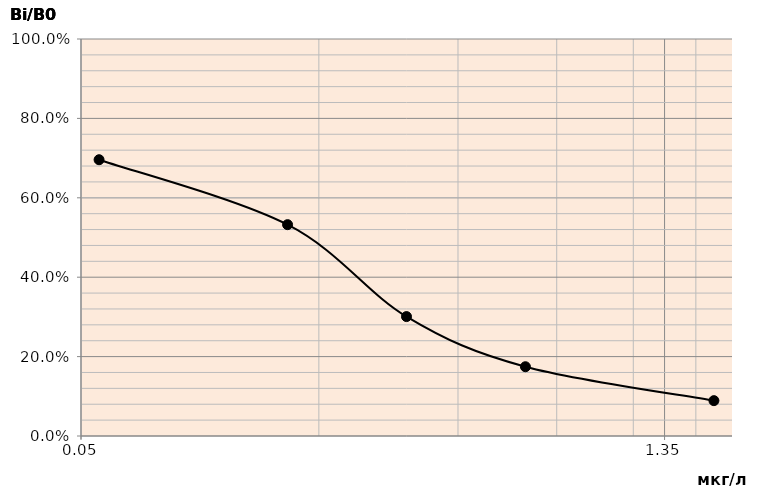
| Category | Series 0 |
|---|---|
| 0.05 | 0.696 |
| 0.15 | 0.532 |
| 0.3 | 0.301 |
| 0.6 | 0.174 |
| 1.8 | 0.089 |